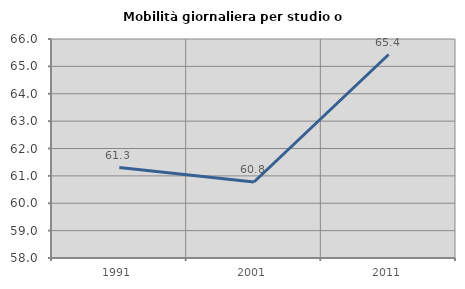
| Category | Mobilità giornaliera per studio o lavoro |
|---|---|
| 1991.0 | 61.306 |
| 2001.0 | 60.777 |
| 2011.0 | 65.434 |